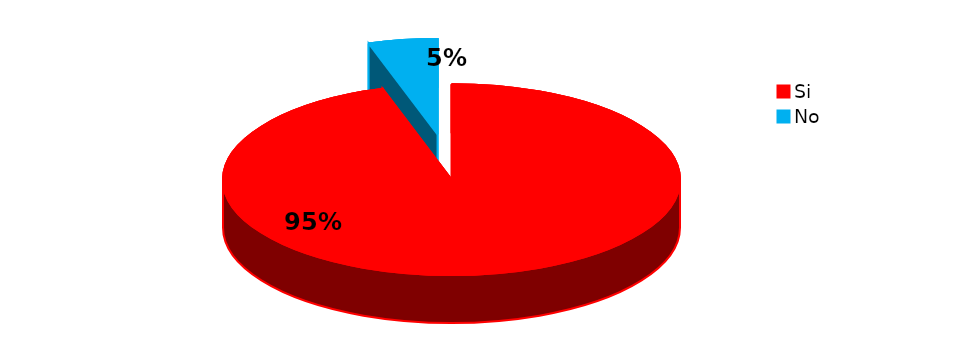
| Category | Series 0 |
|---|---|
| Si | 117 |
| No | 6 |